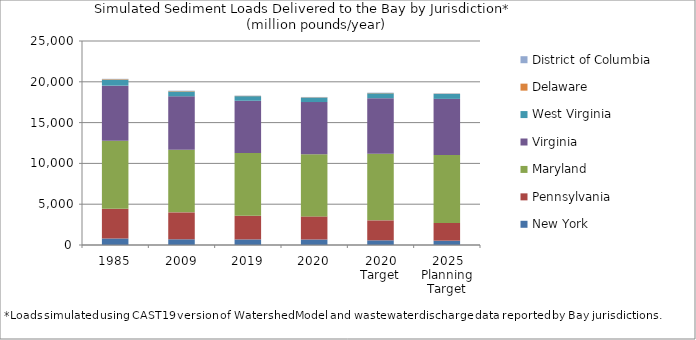
| Category | New York  | Pennsylvania  | Maryland  | Virginia  | West Virginia  | Delaware  | District of Columbia  |
|---|---|---|---|---|---|---|---|
| 1985 | 798.307 | 3638.861 | 8327.376 | 6761.794 | 733.455 | 62.914 | 43.229 |
| 2009 | 699.104 | 3299.531 | 7663.049 | 6556.935 | 597.866 | 50.316 | 43.956 |
| 2019 | 685.035 | 2899.778 | 7693.187 | 6399.061 | 564.735 | 31.451 | 36.518 |
| 2020 | 676.98 | 2828.566 | 7602.048 | 6407.422 | 559.146 | 32.175 | 35.807 |
| 2020 Target | 574.334 | 2445.993 | 8172.91 | 6793.53 | 606.135 | 32.612 | 42.444 |
| 2025 Planning Target | 532.745 | 2161.48 | 8342.863 | 6872.395 | 608.891 | 26.711 | 41.94 |